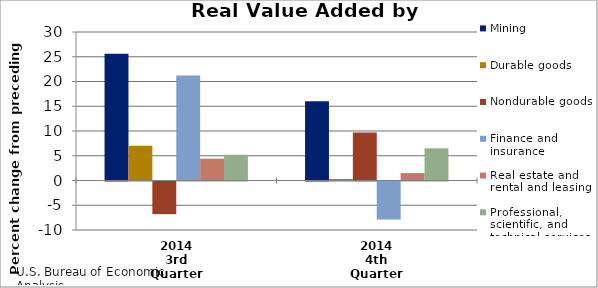
| Category | Mining | Durable goods | Nondurable goods | Finance and insurance | Real estate and rental and leasing | Professional, scientific, and technical services |
|---|---|---|---|---|---|---|
| 2014
3rd Quarter | 25.6 | 7 | -6.6 | 21.2 | 4.4 | 5.2 |
| 2014
4th Quarter | 16 | 0.3 | 9.7 | -7.7 | 1.5 | 6.5 |